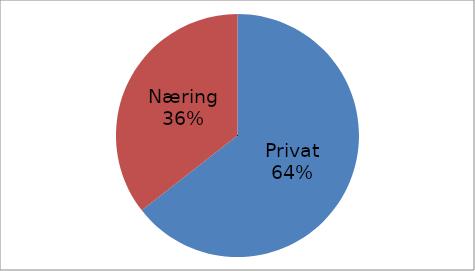
| Category | Series 0 |
|---|---|
| Privat | 38917329 |
| Næring | 21480990 |